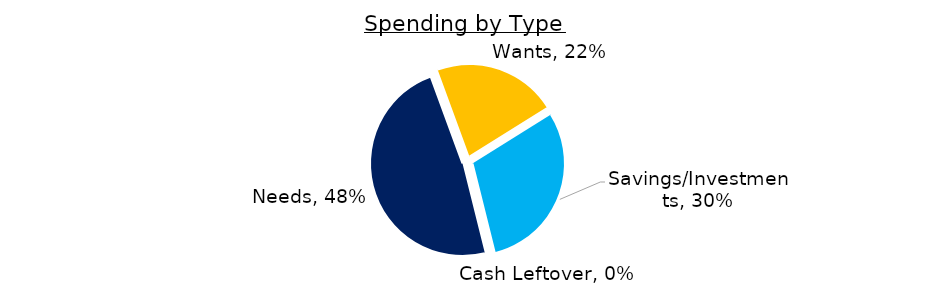
| Category | Series 0 |
|---|---|
| Needs | 0.483 |
| Wants | 0.217 |
| Savings/Investments | 0.3 |
| Cash Leftover | 0 |